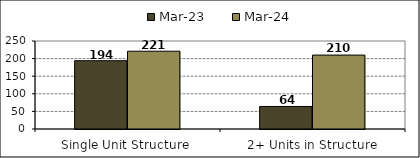
| Category | Mar-23 | Mar-24 |
|---|---|---|
| Single Unit Structure  | 194 | 221 |
| 2+ Units in Structure | 64 | 210 |